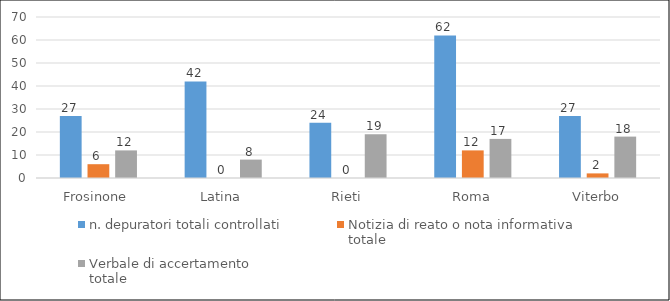
| Category | n. depuratori totali controllati | Notizia di reato o nota informativa
totale | Verbale di accertamento
totale |
|---|---|---|---|
| Frosinone | 27 | 6 | 12 |
| Latina | 42 | 0 | 8 |
| Rieti | 24 | 0 | 19 |
| Roma | 62 | 12 | 17 |
| Viterbo | 27 | 2 | 18 |